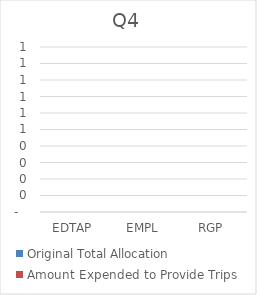
| Category | Original Total Allocation | Amount Expended to Provide Trips |
|---|---|---|
| EDTAP | 0 | 0 |
| EMPL | 0 | 0 |
| RGP | 0 | 0 |